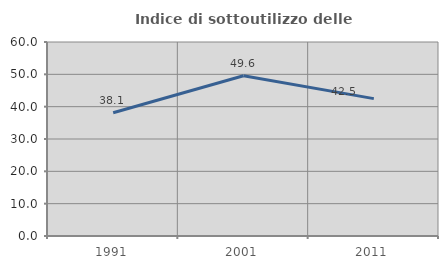
| Category | Indice di sottoutilizzo delle abitazioni  |
|---|---|
| 1991.0 | 38.11 |
| 2001.0 | 49.575 |
| 2011.0 | 42.491 |